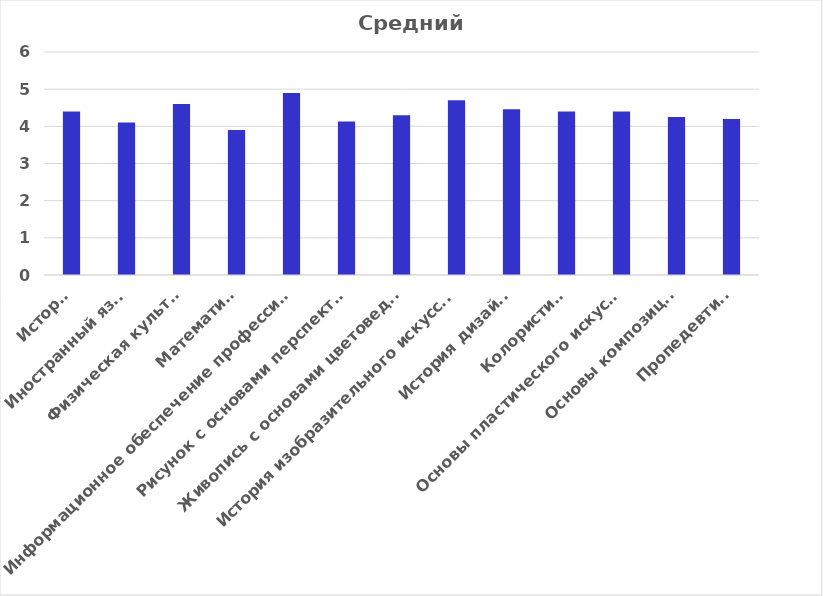
| Category | Средний балл |
|---|---|
| История | 4.4 |
| Иностранный язык | 4.1 |
|  Физическая культура | 4.6 |
| Математика | 3.9 |
|  Информационное обеспечение профессиональной деятельности | 4.9 |
| Рисунок с основами перспективы | 4.13 |
| Живопись с основами цветоведения | 4.3 |
| История изобразительного искусства  | 4.7 |
| История дизайна | 4.46 |
| Колористика  | 4.4 |
| Основы пластического искусства | 4.4 |
| Основы композиции  | 4.25 |
|  Пропедевтика | 4.2 |